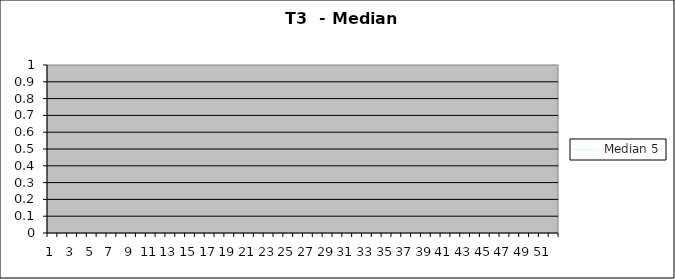
| Category | Median 5 |
|---|---|
| 0 | 0 |
| 1 | 0 |
| 2 | 0 |
| 3 | 0 |
| 4 | 0 |
| 5 | 0 |
| 6 | 0 |
| 7 | 0 |
| 8 | 0 |
| 9 | 0 |
| 10 | 0 |
| 11 | 0 |
| 12 | 0 |
| 13 | 0 |
| 14 | 0 |
| 15 | 0 |
| 16 | 0 |
| 17 | 0 |
| 18 | 0 |
| 19 | 0 |
| 20 | 0 |
| 21 | 0 |
| 22 | 0 |
| 23 | 0 |
| 24 | 0 |
| 25 | 0 |
| 26 | 0 |
| 27 | 0 |
| 28 | 0 |
| 29 | 0 |
| 30 | 0 |
| 31 | 0 |
| 32 | 0 |
| 33 | 0 |
| 34 | 0 |
| 35 | 0 |
| 36 | 0 |
| 37 | 0 |
| 38 | 0 |
| 39 | 0 |
| 40 | 0 |
| 41 | 0 |
| 42 | 0 |
| 43 | 0 |
| 44 | 0 |
| 45 | 0 |
| 46 | 0 |
| 47 | 0 |
| 48 | 0 |
| 49 | 0 |
| 50 | 0 |
| 51 | 0 |